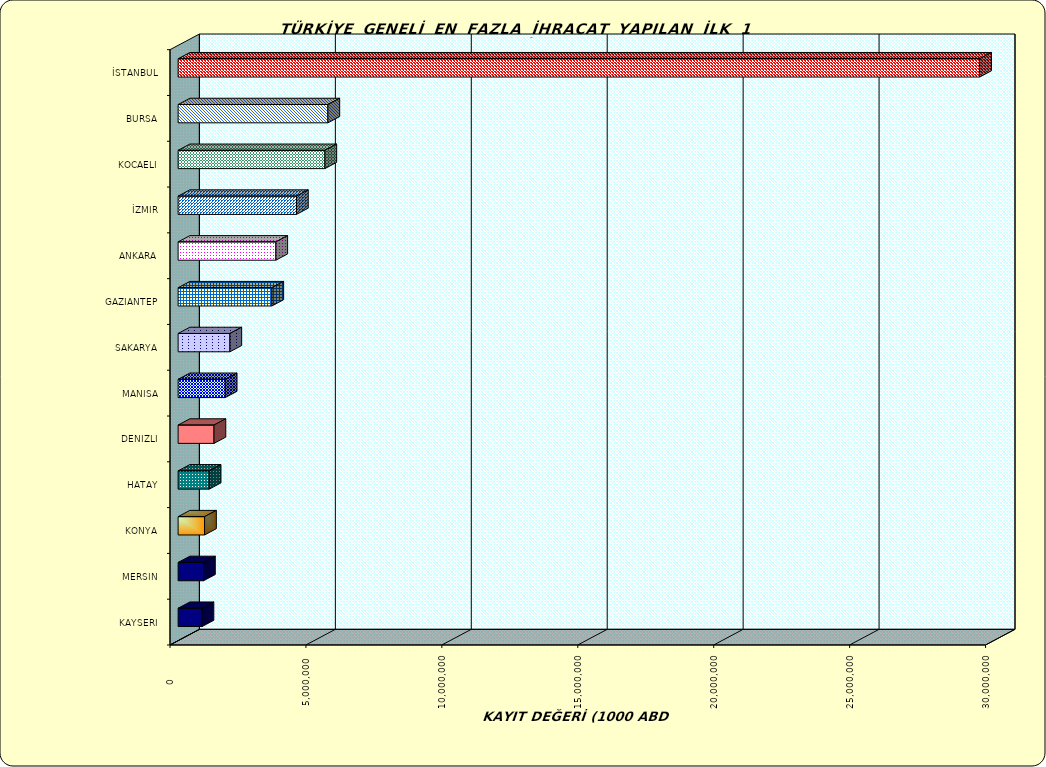
| Category | Series 0 |
|---|---|
| İSTANBUL | 29485152.671 |
| BURSA | 5509969.157 |
| KOCAELI | 5399367.855 |
| İZMIR | 4353861.013 |
| ANKARA | 3595188.9 |
| GAZIANTEP | 3447685.602 |
| SAKARYA | 1904620.398 |
| MANISA | 1733673.811 |
| DENIZLI | 1320334.267 |
| HATAY | 1142944.233 |
| KONYA | 973328.005 |
| MERSIN | 934632.735 |
| KAYSERI | 879990.433 |